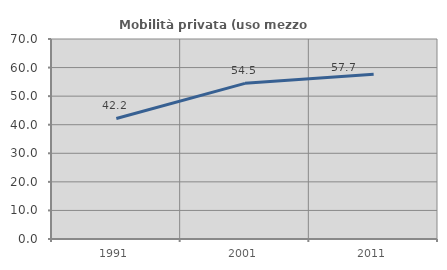
| Category | Mobilità privata (uso mezzo privato) |
|---|---|
| 1991.0 | 42.177 |
| 2001.0 | 54.482 |
| 2011.0 | 57.651 |